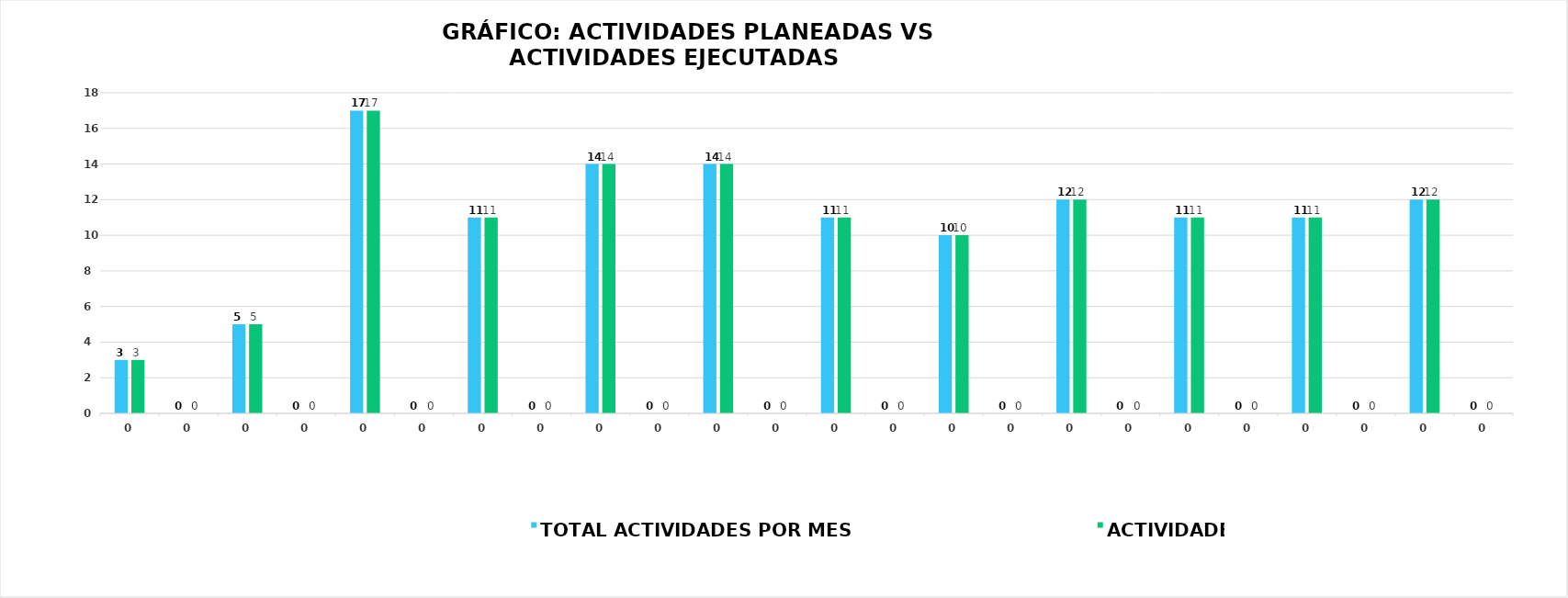
| Category | TOTAL ACTIVIDADES POR MES | ACTIVIDADES EJECUTADAS |
|---|---|---|
| 0.0 | 3 | 3 |
| 0.0 | 0 | 0 |
| 0.0 | 5 | 5 |
| 0.0 | 0 | 0 |
| 0.0 | 17 | 17 |
| 0.0 | 0 | 0 |
| 0.0 | 11 | 11 |
| 0.0 | 0 | 0 |
| 0.0 | 14 | 14 |
| 0.0 | 0 | 0 |
| 0.0 | 14 | 14 |
| 0.0 | 0 | 0 |
| 0.0 | 11 | 11 |
| 0.0 | 0 | 0 |
| 0.0 | 10 | 10 |
| 0.0 | 0 | 0 |
| 0.0 | 12 | 12 |
| 0.0 | 0 | 0 |
| 0.0 | 11 | 11 |
| 0.0 | 0 | 0 |
| 0.0 | 11 | 11 |
| 0.0 | 0 | 0 |
| 0.0 | 12 | 12 |
| 0.0 | 0 | 0 |